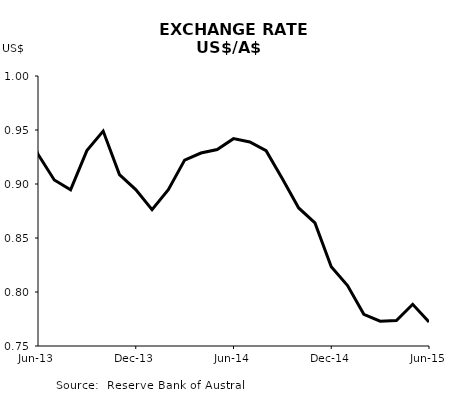
| Category | US$:A$ |
|---|---|
| 2012-07-01 | 1.053 |
| 2012-08-01 | 1.03 |
| 2012-09-01 | 1.046 |
| 2012-10-01 | 1.038 |
| 2012-11-01 | 1.043 |
| 2012-12-01 | 1.038 |
| 2013-01-01 | 1.039 |
| 2013-02-01 | 1.028 |
| 2013-03-01 | 1.043 |
| 2013-04-01 | 1.037 |
| 2013-05-01 | 0.965 |
| 2013-06-01 | 0.928 |
| 2013-07-01 | 0.904 |
| 2013-08-01 | 0.895 |
| 2013-09-01 | 0.931 |
| 2013-10-01 | 0.949 |
| 2013-11-01 | 0.909 |
| 2013-12-01 | 0.895 |
| 2014-01-01 | 0.876 |
| 2014-02-01 | 0.895 |
| 2014-03-01 | 0.922 |
| 2014-04-01 | 0.929 |
| 2014-05-01 | 0.932 |
| 2014-06-01 | 0.942 |
| 2014-07-01 | 0.939 |
| 2014-08-01 | 0.931 |
| 2014-09-01 | 0.905 |
| 2014-10-01 | 0.878 |
| 2014-11-01 | 0.864 |
| 2014-12-01 | 0.823 |
| 2015-01-01 | 0.806 |
| 2015-02-01 | 0.779 |
| 2015-03-01 | 0.773 |
| 2015-04-01 | 0.774 |
| 2015-05-01 | 0.789 |
| 2015-06-01 | 0.772 |